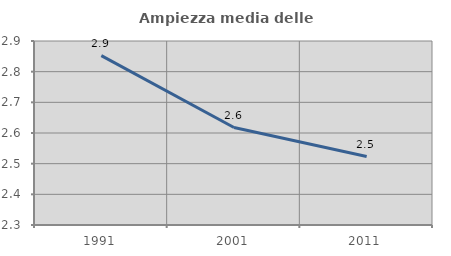
| Category | Ampiezza media delle famiglie |
|---|---|
| 1991.0 | 2.852 |
| 2001.0 | 2.618 |
| 2011.0 | 2.523 |